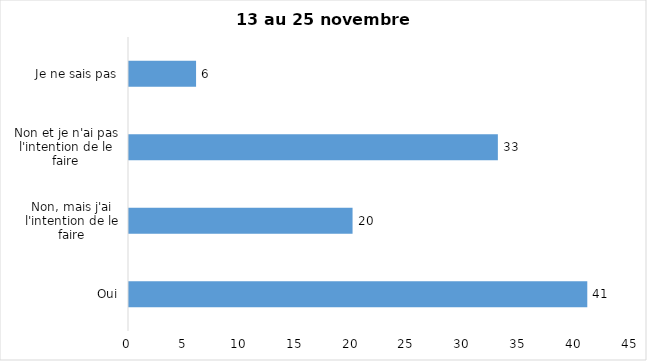
| Category | Series 0 |
|---|---|
| Oui | 41 |
| Non, mais j'ai l'intention de le faire | 20 |
| Non et je n'ai pas l'intention de le faire | 33 |
| Je ne sais pas | 6 |